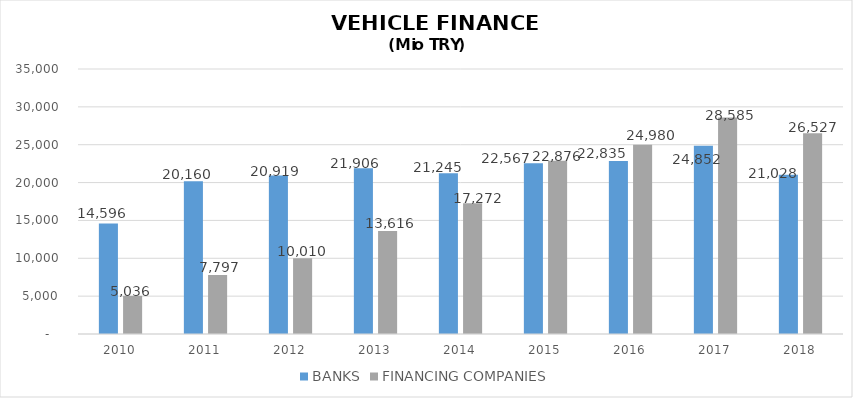
| Category | BANKS | FINANCING COMPANIES |
|---|---|---|
| 2010 | 14596 | 5035.89 |
| 2011 | 20160 | 7796.854 |
| 2012 | 20919 | 10009.755 |
| 2013 | 21906 | 13616.036 |
| 2014 | 21245 | 17271.844 |
| 2015 | 22567 | 22875.563 |
| 2016 | 22835 | 24980.231 |
| 2017 | 24852 | 28584.938 |
| 2018 | 21028 | 26527.133 |